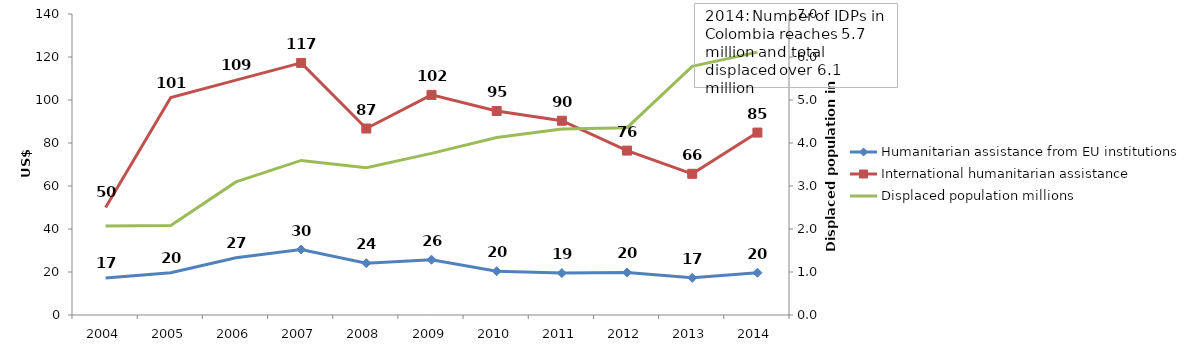
| Category | Humanitarian assistance from EU institutions | International humanitarian assistance |
|---|---|---|
| 2004.0 | 17.23 | 50.038 |
| 2005.0 | 19.66 | 101.143 |
| 2006.0 | 26.62 | 109.249 |
| 2007.0 | 30.46 | 117.249 |
| 2008.0 | 24.11 | 86.733 |
| 2009.0 | 25.7 | 102.376 |
| 2010.0 | 20.36 | 94.894 |
| 2011.0 | 19.48 | 90.358 |
| 2012.0 | 19.79 | 76.462 |
| 2013.0 | 17.28 | 65.679 |
| 2014.0 | 19.666 | 84.843 |